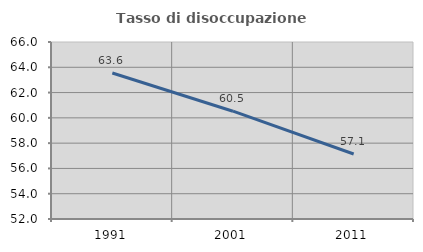
| Category | Tasso di disoccupazione giovanile  |
|---|---|
| 1991.0 | 63.551 |
| 2001.0 | 60.526 |
| 2011.0 | 57.143 |